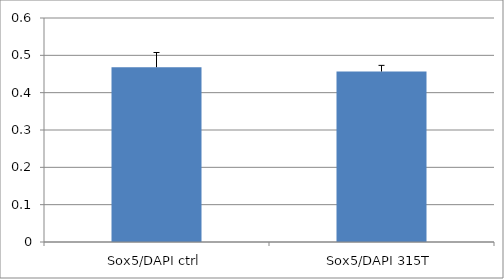
| Category | Series 0 |
|---|---|
| Sox5/DAPI ctrl | 0.468 |
| Sox5/DAPI 315T | 0.457 |